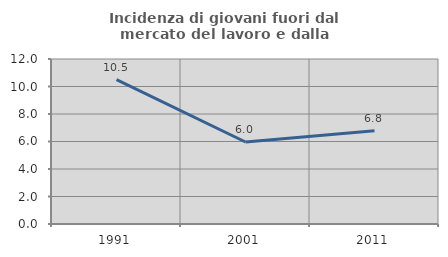
| Category | Incidenza di giovani fuori dal mercato del lavoro e dalla formazione  |
|---|---|
| 1991.0 | 10.495 |
| 2001.0 | 5.962 |
| 2011.0 | 6.786 |